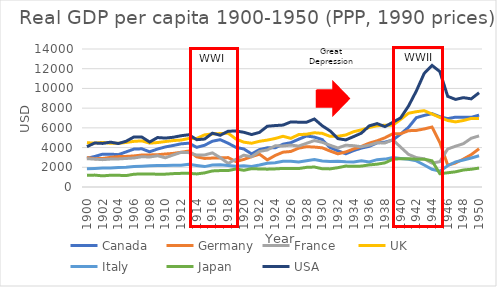
| Category | Canada | Germany | France | UK | Italy | Japan | USA |
|---|---|---|---|---|---|---|---|
| 1900.0 | 2911.266 | 2984.759 | 2875.686 | 4491.814 | 1854.688 | 1179.513 | 4090.787 |
| 1901.0 | 3096.777 | 2871.333 | 2826.495 | 4450.398 | 1885.208 | 1206.463 | 4463.863 |
| 1902.0 | 3330.925 | 2893.467 | 2775.29 | 4525.281 | 1915.135 | 1128.905 | 4420.63 |
| 1903.0 | 3333.628 | 3008.158 | 2830.548 | 4439.616 | 1932.491 | 1192.628 | 4550.894 |
| 1904.0 | 3279.564 | 3083.353 | 2846.708 | 4427.944 | 1966.435 | 1188.088 | 4409.532 |
| 1905.0 | 3561.817 | 3104.045 | 2894.02 | 4520.476 | 2006.747 | 1156.755 | 4642.164 |
| 1906.0 | 3846.207 | 3152.137 | 2943.281 | 4631.085 | 2074.707 | 1297.21 | 5079.124 |
| 1907.0 | 3874.85 | 3244.873 | 3070.329 | 4678.579 | 2111.641 | 1325.155 | 5064.89 |
| 1908.0 | 3572.061 | 3254.311 | 3044.949 | 4449.192 | 2156.211 | 1318.439 | 4560.616 |
| 1909.0 | 3849.598 | 3274.706 | 3166.815 | 4510.523 | 2173.417 | 1300.542 | 5017.496 |
| 1910.0 | 4065.761 | 3347.648 | 2965.207 | 4610.78 | 2175.518 | 1303.755 | 4963.736 |
| 1911.0 | 4212.538 | 3408.404 | 3249.577 | 4708.9 | 2199.161 | 1355.578 | 5045.684 |
| 1912.0 | 4377.131 | 3523.694 | 3514.493 | 4761.747 | 2201.377 | 1384.083 | 5200.698 |
| 1913.0 | 4446.765 | 3648.006 | 3484.77 | 4920.546 | 2304.793 | 1386.689 | 5300.729 |
| 1914.0 | 4025.285 | 3059.29 | 3236.336 | 4926.582 | 2179.156 | 1326.502 | 4799.201 |
| 1915.0 | 4232.888 | 2899.012 | 3248.067 | 5288.266 | 2069.694 | 1429.715 | 4864.193 |
| 1916.0 | 4646.115 | 2934.503 | 3463.331 | 5384.38 | 2240.26 | 1629.718 | 5458.693 |
| 1917.0 | 4800.581 | 2952.079 | 2978.927 | 5421.016 | 2247.153 | 1665.063 | 5247.737 |
| 1918.0 | 4440.595 | 2983.157 | 2395.529 | 5459.315 | 2190.668 | 1668.413 | 5658.984 |
| 1919.0 | 4019.343 | 2586.272 | 2811.375 | 4870.408 | 2102.738 | 1827.214 | 5680.406 |
| 1920.0 | 3861.476 | 2795.596 | 3226.921 | 4547.914 | 2152.784 | 1695.754 | 5552.327 |
| 1921.0 | 3357.01 | 3077.826 | 3074.626 | 4439.151 | 2079.5 | 1859.503 | 5322.734 |
| 1922.0 | 3793.146 | 3330.985 | 3610.392 | 4636.935 | 2231.232 | 1831.122 | 5539.844 |
| 1923.0 | 3975.958 | 2749.579 | 3753.526 | 4759.71 | 2413.777 | 1809.35 | 6164.199 |
| 1924.0 | 3977.019 | 3198.829 | 4179.464 | 4920.942 | 2456.98 | 1836.317 | 6232.551 |
| 1925.0 | 4340.276 | 3531.678 | 4166.378 | 5144.494 | 2602.341 | 1885.162 | 6282.419 |
| 1926.0 | 4497.057 | 3604.636 | 4249.469 | 4936.114 | 2600.228 | 1871.578 | 6602.442 |
| 1927.0 | 4846.996 | 3941.099 | 4153.971 | 5314.938 | 2530.703 | 1869.767 | 6576.499 |
| 1928.0 | 5171.589 | 4089.994 | 4431.465 | 5356.965 | 2666.2 | 1992.372 | 6569.345 |
| 1929.0 | 5065.446 | 4051.406 | 4709.998 | 5503.318 | 2777.99 | 2025.735 | 6898.722 |
| 1930.0 | 4810.605 | 3973.358 | 4531.558 | 5440.862 | 2630.982 | 1850.391 | 6212.713 |
| 1931.0 | 4003.693 | 3651.514 | 4235.26 | 5138.416 | 2578.905 | 1837.341 | 5691.367 |
| 1932.0 | 3671.453 | 3361.678 | 3959.123 | 5148.253 | 2615.175 | 1961.583 | 4908.366 |
| 1933.0 | 3370.406 | 3555.788 | 4239.126 | 5277.461 | 2565.061 | 2122.436 | 4776.915 |
| 1934.0 | 3691.03 | 3858.212 | 4191.731 | 5607.508 | 2538.053 | 2098.342 | 5113.608 |
| 1935.0 | 3950.625 | 4119.813 | 4085.931 | 5799.005 | 2654.108 | 2120.468 | 5466.838 |
| 1936.0 | 4124.206 | 4450.742 | 4243.998 | 6035.169 | 2540.304 | 2244.421 | 6203.884 |
| 1937.0 | 4473.41 | 4684.923 | 4486.637 | 6217.619 | 2772.274 | 2315.116 | 6430.121 |
| 1938.0 | 4545.91 | 4993.597 | 4466.211 | 6266.452 | 2830.122 | 2449.275 | 6126.466 |
| 1939.0 | 4768.131 | 5406.244 | 4793.311 | 6262.401 | 2980.825 | 2816.057 | 6560.753 |
| 1940.0 | 5368.245 | 5402.506 | 4042.168 | 6856.005 | 2897.093 | 2874.29 | 7009.637 |
| 1941.0 | 6050.767 | 5711.15 | 3309.382 | 7481.676 | 2822.257 | 2872.704 | 8205.683 |
| 1942.0 | 7033.376 | 5739.927 | 2981.461 | 7638.868 | 2648.295 | 2818.217 | 9741.105 |
| 1943.0 | 7262.759 | 5889.648 | 2860.141 | 7743.702 | 2233.864 | 2821.623 | 11518.172 |
| 1944.0 | 7442.561 | 6083.747 | 2421.769 | 7405.392 | 1797.188 | 2658.973 | 12333.45 |
| 1945.0 | 7132.953 | 4514.284 | 2573.142 | 7056.135 | 1608.635 | 1346.126 | 11708.648 |
| 1946.0 | 6931.243 | 2216.843 | 3855.192 | 6745.34 | 2161.68 | 1444.216 | 9196.543 |
| 1947.0 | 7088.211 | 2436.091 | 4137.898 | 6604.411 | 2555.551 | 1540.944 | 8885.994 |
| 1948.0 | 7065.324 | 2833.717 | 4393.365 | 6745.636 | 2735.259 | 1725.286 | 9064.562 |
| 1949.0 | 7064.08 | 3282.464 | 4946.345 | 6955.693 | 2948.367 | 1799.826 | 8943.744 |
| 1950.0 | 7291.48 | 3880.887 | 5185.851 | 6939.374 | 3171.702 | 1920.721 | 9561.348 |